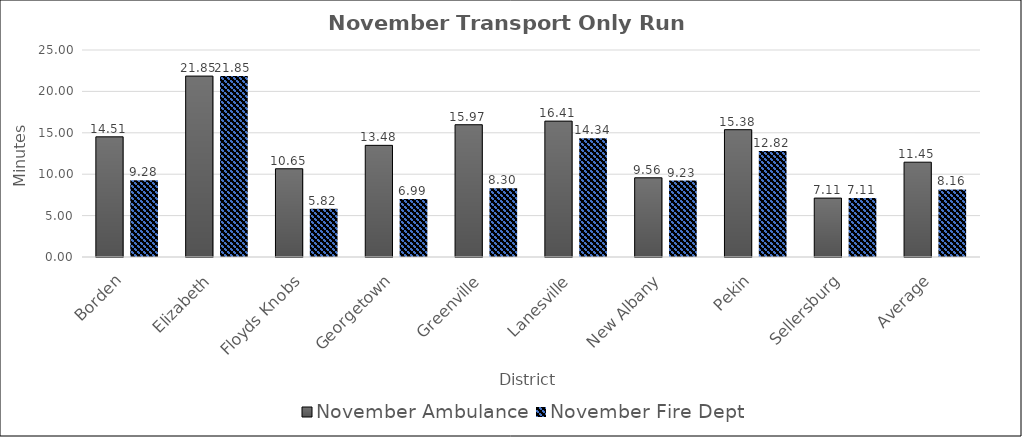
| Category | November |
|---|---|
| Borden | 9.279 |
| Elizabeth | 21.85 |
| Floyds Knobs | 5.824 |
| Georgetown | 6.992 |
| Greenville | 8.296 |
| Lanesville | 14.34 |
| New Albany | 9.233 |
| Pekin | 12.817 |
| Sellersburg | 7.112 |
| Average | 8.16 |